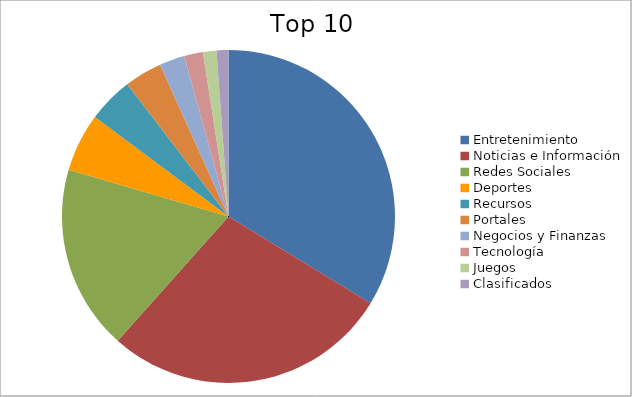
| Category | Series 0 |
|---|---|
| Entretenimiento | 31.96 |
| Noticias e Información | 26.39 |
| Redes Sociales | 17 |
| Deportes | 5.36 |
| Recursos | 4.18 |
| Portales | 3.47 |
| Negocios y Finanzas | 2.32 |
| Tecnología | 1.74 |
| Juegos | 1.24 |
| Clasificados | 1.09 |